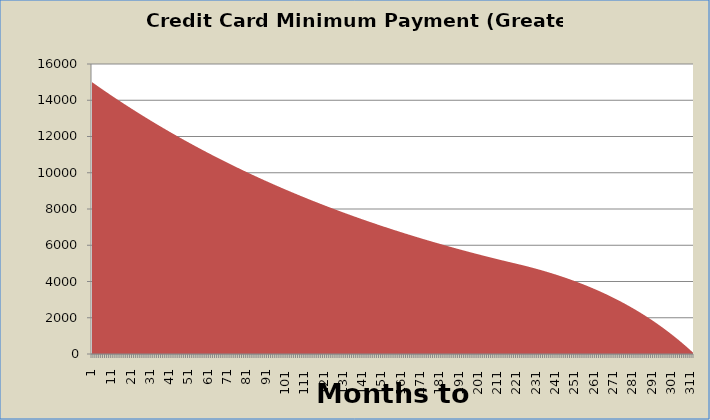
| Category | Balance |
|---|---|
| 1.0 | 15000 |
| 2.0 | 14925 |
| 3.0 | 14850.38 |
| 4.0 | 14776.13 |
| 5.0 | 14702.25 |
| 6.0 | 14628.73 |
| 7.0 | 14555.59 |
| 8.0 | 14482.81 |
| 9.0 | 14410.39 |
| 10.0 | 14338.34 |
| 11.0 | 14266.65 |
| 12.0 | 14195.32 |
| 13.0 | 14124.34 |
| 14.0 | 14053.72 |
| 15.0 | 13983.46 |
| 16.0 | 13913.54 |
| 17.0 | 13843.97 |
| 18.0 | 13774.75 |
| 19.0 | 13705.87 |
| 20.0 | 13637.34 |
| 21.0 | 13569.15 |
| 22.0 | 13501.31 |
| 23.0 | 13433.8 |
| 24.0 | 13366.63 |
| 25.0 | 13299.8 |
| 26.0 | 13233.3 |
| 27.0 | 13167.13 |
| 28.0 | 13101.3 |
| 29.0 | 13035.79 |
| 30.0 | 12970.61 |
| 31.0 | 12905.76 |
| 32.0 | 12841.23 |
| 33.0 | 12777.03 |
| 34.0 | 12713.15 |
| 35.0 | 12649.59 |
| 36.0 | 12586.34 |
| 37.0 | 12523.41 |
| 38.0 | 12460.79 |
| 39.0 | 12398.48 |
| 40.0 | 12336.49 |
| 41.0 | 12274.81 |
| 42.0 | 12213.43 |
| 43.0 | 12152.36 |
| 44.0 | 12091.6 |
| 45.0 | 12031.14 |
| 46.0 | 11970.99 |
| 47.0 | 11911.13 |
| 48.0 | 11851.58 |
| 49.0 | 11792.32 |
| 50.0 | 11733.35 |
| 51.0 | 11674.68 |
| 52.0 | 11616.31 |
| 53.0 | 11558.22 |
| 54.0 | 11500.43 |
| 55.0 | 11442.93 |
| 56.0 | 11385.71 |
| 57.0 | 11328.79 |
| 58.0 | 11272.14 |
| 59.0 | 11215.78 |
| 60.0 | 11159.7 |
| 61.0 | 11103.91 |
| 62.0 | 11048.39 |
| 63.0 | 10993.15 |
| 64.0 | 10938.19 |
| 65.0 | 10883.5 |
| 66.0 | 10829.08 |
| 67.0 | 10774.94 |
| 68.0 | 10721.06 |
| 69.0 | 10667.46 |
| 70.0 | 10614.12 |
| 71.0 | 10561.05 |
| 72.0 | 10508.25 |
| 73.0 | 10455.7 |
| 74.0 | 10403.43 |
| 75.0 | 10351.41 |
| 76.0 | 10299.65 |
| 77.0 | 10248.15 |
| 78.0 | 10196.91 |
| 79.0 | 10145.92 |
| 80.0 | 10095.19 |
| 81.0 | 10044.72 |
| 82.0 | 9994.5 |
| 83.0 | 9944.53 |
| 84.0 | 9894.81 |
| 85.0 | 9845.33 |
| 86.0 | 9796.1 |
| 87.0 | 9747.12 |
| 88.0 | 9698.39 |
| 89.0 | 9649.9 |
| 90.0 | 9601.65 |
| 91.0 | 9553.64 |
| 92.0 | 9505.87 |
| 93.0 | 9458.34 |
| 94.0 | 9411.05 |
| 95.0 | 9364 |
| 96.0 | 9317.18 |
| 97.0 | 9270.6 |
| 98.0 | 9224.25 |
| 99.0 | 9178.12 |
| 100.0 | 9132.23 |
| 101.0 | 9086.57 |
| 102.0 | 9041.14 |
| 103.0 | 8995.94 |
| 104.0 | 8950.96 |
| 105.0 | 8906.2 |
| 106.0 | 8861.67 |
| 107.0 | 8817.37 |
| 108.0 | 8773.28 |
| 109.0 | 8729.41 |
| 110.0 | 8685.76 |
| 111.0 | 8642.33 |
| 112.0 | 8599.11 |
| 113.0 | 8556.12 |
| 114.0 | 8513.34 |
| 115.0 | 8470.77 |
| 116.0 | 8428.41 |
| 117.0 | 8386.27 |
| 118.0 | 8344.33 |
| 119.0 | 8302.6 |
| 120.0 | 8261.09 |
| 121.0 | 8219.79 |
| 122.0 | 8178.69 |
| 123.0 | 8137.8 |
| 124.0 | 8097.11 |
| 125.0 | 8056.63 |
| 126.0 | 8016.35 |
| 127.0 | 7976.27 |
| 128.0 | 7936.38 |
| 129.0 | 7896.7 |
| 130.0 | 7857.22 |
| 131.0 | 7817.94 |
| 132.0 | 7778.85 |
| 133.0 | 7739.95 |
| 134.0 | 7701.25 |
| 135.0 | 7662.74 |
| 136.0 | 7624.43 |
| 137.0 | 7586.31 |
| 138.0 | 7548.37 |
| 139.0 | 7510.63 |
| 140.0 | 7473.08 |
| 141.0 | 7435.72 |
| 142.0 | 7398.55 |
| 143.0 | 7361.56 |
| 144.0 | 7324.75 |
| 145.0 | 7288.12 |
| 146.0 | 7251.68 |
| 147.0 | 7215.43 |
| 148.0 | 7179.35 |
| 149.0 | 7143.45 |
| 150.0 | 7107.73 |
| 151.0 | 7072.2 |
| 152.0 | 7036.84 |
| 153.0 | 7001.65 |
| 154.0 | 6966.64 |
| 155.0 | 6931.81 |
| 156.0 | 6897.15 |
| 157.0 | 6862.67 |
| 158.0 | 6828.36 |
| 159.0 | 6794.22 |
| 160.0 | 6760.25 |
| 161.0 | 6726.44 |
| 162.0 | 6692.81 |
| 163.0 | 6659.34 |
| 164.0 | 6626.04 |
| 165.0 | 6592.91 |
| 166.0 | 6559.94 |
| 167.0 | 6527.14 |
| 168.0 | 6494.51 |
| 169.0 | 6462.04 |
| 170.0 | 6429.73 |
| 171.0 | 6397.59 |
| 172.0 | 6365.6 |
| 173.0 | 6333.77 |
| 174.0 | 6302.1 |
| 175.0 | 6270.59 |
| 176.0 | 6239.24 |
| 177.0 | 6208.05 |
| 178.0 | 6177.01 |
| 179.0 | 6146.13 |
| 180.0 | 6115.4 |
| 181.0 | 6084.82 |
| 182.0 | 6054.39 |
| 183.0 | 6024.12 |
| 184.0 | 5994 |
| 185.0 | 5964.03 |
| 186.0 | 5934.21 |
| 187.0 | 5904.54 |
| 188.0 | 5875.02 |
| 189.0 | 5845.65 |
| 190.0 | 5816.42 |
| 191.0 | 5787.34 |
| 192.0 | 5758.4 |
| 193.0 | 5729.61 |
| 194.0 | 5700.96 |
| 195.0 | 5672.45 |
| 196.0 | 5644.09 |
| 197.0 | 5615.87 |
| 198.0 | 5587.79 |
| 199.0 | 5559.85 |
| 200.0 | 5532.05 |
| 201.0 | 5504.39 |
| 202.0 | 5476.87 |
| 203.0 | 5449.48 |
| 204.0 | 5422.23 |
| 205.0 | 5395.12 |
| 206.0 | 5368.15 |
| 207.0 | 5341.31 |
| 208.0 | 5314.6 |
| 209.0 | 5288.03 |
| 210.0 | 5261.59 |
| 211.0 | 5235.28 |
| 212.0 | 5209.1 |
| 213.0 | 5183.06 |
| 214.0 | 5157.15 |
| 215.0 | 5131.37 |
| 216.0 | 5105.71 |
| 217.0 | 5080.19 |
| 218.0 | 5054.79 |
| 219.0 | 5029.51 |
| 220.0 | 5004.36 |
| 221.0 | 4979.34 |
| 222.0 | 4954.03 |
| 223.0 | 4928.34 |
| 224.0 | 4902.27 |
| 225.0 | 4875.8 |
| 226.0 | 4848.94 |
| 227.0 | 4821.67 |
| 228.0 | 4794 |
| 229.0 | 4765.91 |
| 230.0 | 4737.4 |
| 231.0 | 4708.46 |
| 232.0 | 4679.09 |
| 233.0 | 4649.28 |
| 234.0 | 4619.02 |
| 235.0 | 4588.31 |
| 236.0 | 4557.13 |
| 237.0 | 4525.49 |
| 238.0 | 4493.37 |
| 239.0 | 4460.77 |
| 240.0 | 4427.68 |
| 241.0 | 4394.1 |
| 242.0 | 4360.01 |
| 243.0 | 4325.41 |
| 244.0 | 4290.29 |
| 245.0 | 4254.64 |
| 246.0 | 4218.46 |
| 247.0 | 4181.74 |
| 248.0 | 4144.47 |
| 249.0 | 4106.64 |
| 250.0 | 4068.24 |
| 251.0 | 4029.26 |
| 252.0 | 3989.7 |
| 253.0 | 3949.55 |
| 254.0 | 3908.79 |
| 255.0 | 3867.42 |
| 256.0 | 3825.43 |
| 257.0 | 3782.81 |
| 258.0 | 3739.55 |
| 259.0 | 3695.64 |
| 260.0 | 3651.07 |
| 261.0 | 3605.84 |
| 262.0 | 3559.93 |
| 263.0 | 3513.33 |
| 264.0 | 3466.03 |
| 265.0 | 3418.02 |
| 266.0 | 3369.29 |
| 267.0 | 3319.83 |
| 268.0 | 3269.63 |
| 269.0 | 3218.67 |
| 270.0 | 3166.95 |
| 271.0 | 3114.45 |
| 272.0 | 3061.17 |
| 273.0 | 3007.09 |
| 274.0 | 2952.2 |
| 275.0 | 2896.48 |
| 276.0 | 2839.93 |
| 277.0 | 2782.53 |
| 278.0 | 2724.27 |
| 279.0 | 2665.13 |
| 280.0 | 2605.11 |
| 281.0 | 2544.19 |
| 282.0 | 2482.35 |
| 283.0 | 2419.59 |
| 284.0 | 2355.88 |
| 285.0 | 2291.22 |
| 286.0 | 2225.59 |
| 287.0 | 2158.97 |
| 288.0 | 2091.35 |
| 289.0 | 2022.72 |
| 290.0 | 1953.06 |
| 291.0 | 1882.36 |
| 292.0 | 1810.6 |
| 293.0 | 1737.76 |
| 294.0 | 1663.83 |
| 295.0 | 1588.79 |
| 296.0 | 1512.62 |
| 297.0 | 1435.31 |
| 298.0 | 1356.84 |
| 299.0 | 1277.19 |
| 300.0 | 1196.35 |
| 301.0 | 1114.3 |
| 302.0 | 1031.01 |
| 303.0 | 946.48 |
| 304.0 | 860.68 |
| 305.0 | 773.59 |
| 306.0 | 685.19 |
| 307.0 | 595.47 |
| 308.0 | 504.4 |
| 309.0 | 411.97 |
| 310.0 | 318.15 |
| 311.0 | 222.92 |
| 312.0 | 126.26 |
| 313.0 | 28.15 |